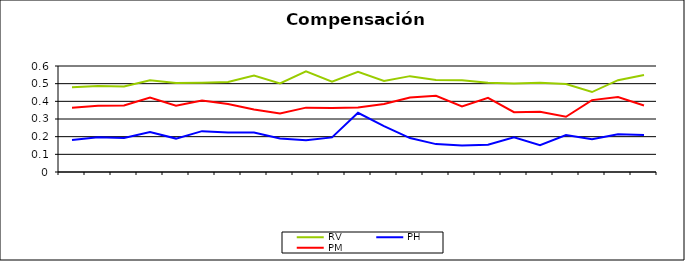
| Category | RV | PH | PM |
|---|---|---|---|
| 0 | 0.479 | 0.181 | 0.364 |
| 1 | 0.487 | 0.196 | 0.375 |
| 2 | 0.484 | 0.192 | 0.376 |
| 3 | 0.52 | 0.226 | 0.421 |
| 4 | 0.504 | 0.189 | 0.375 |
| 5 | 0.506 | 0.231 | 0.404 |
| 6 | 0.51 | 0.224 | 0.384 |
| 7 | 0.546 | 0.223 | 0.353 |
| 8 | 0.501 | 0.19 | 0.331 |
| 9 | 0.57 | 0.18 | 0.364 |
| 10 | 0.511 | 0.196 | 0.363 |
| 11 | 0.567 | 0.335 | 0.365 |
| 12 | 0.515 | 0.26 | 0.385 |
| 13 | 0.543 | 0.192 | 0.422 |
| 14 | 0.52 | 0.158 | 0.431 |
| 15 | 0.519 | 0.15 | 0.371 |
| 16 | 0.505 | 0.154 | 0.42 |
| 17 | 0.501 | 0.196 | 0.339 |
| 18 | 0.506 | 0.151 | 0.341 |
| 19 | 0.498 | 0.209 | 0.313 |
| 20 | 0.453 | 0.186 | 0.407 |
| 21 | 0.52 | 0.213 | 0.424 |
| 22 | 0.549 | 0.21 | 0.376 |